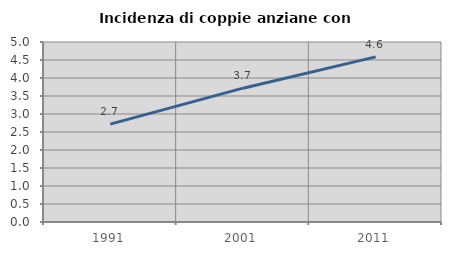
| Category | Incidenza di coppie anziane con figli |
|---|---|
| 1991.0 | 2.719 |
| 2001.0 | 3.717 |
| 2011.0 | 4.586 |